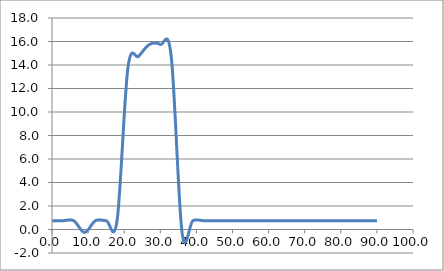
| Category | Elevation (in.) |
|---|---|
| 0.024 | 0.75 |
| 3.024 | 0.75 |
| 6.024 | 0.75 |
| 9.024000000000001 | -0.25 |
| 12.024000000000001 | 0.75 |
| 15.024000000000001 | 0.75 |
| 18.024 | 0.75 |
| 21.024 | 13.75 |
| 24.023999999999997 | 14.75 |
| 27.023999999999997 | 15.75 |
| 30.023999999999997 | 15.75 |
| 33.024 | 14.75 |
| 36.024 | -0.25 |
| 39.024 | 0.75 |
| 42.024 | 0.75 |
| 45.024 | 0.75 |
| 48.024 | 0.75 |
| 51.024 | 0.75 |
| 54.024 | 0.75 |
| 57.024 | 0.75 |
| 60.024 | 0.75 |
| 63.024 | 0.75 |
| 66.024 | 0.75 |
| 69.024 | 0.75 |
| 72.024 | 0.75 |
| 75.024 | 0.75 |
| 78.024 | 0.75 |
| 81.024 | 0.75 |
| 84.024 | 0.75 |
| 87.024 | 0.75 |
| 90.024 | 0.75 |